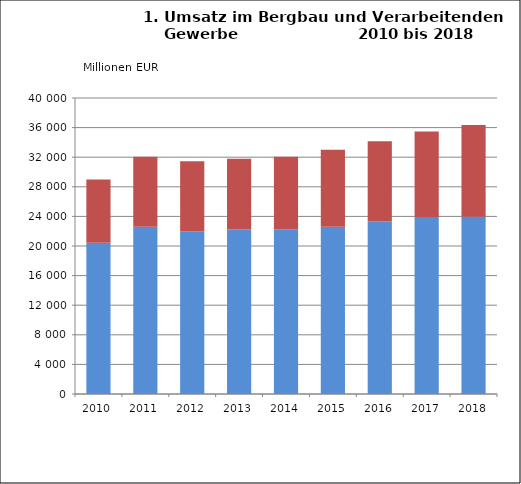
| Category | Inland umsatz | Ausland umsatz |
|---|---|---|
| 2010.0 | 20440.329 | 8560.204 |
| 2011.0 | 22606.685 | 9451.682 |
| 2012.0 | 21971.623 | 9490.007 |
| 2013.0 | 22235.95 | 9555.079 |
| 2014.0 | 22238.159 | 9816.082 |
| 2015.0 | 22613.676 | 10383.052 |
| 2016.0 | 23301.648 | 10851.594 |
| 2017.0 | 23932.875 | 11547.301 |
| 2018.0 | 23966.904 | 12373.466 |